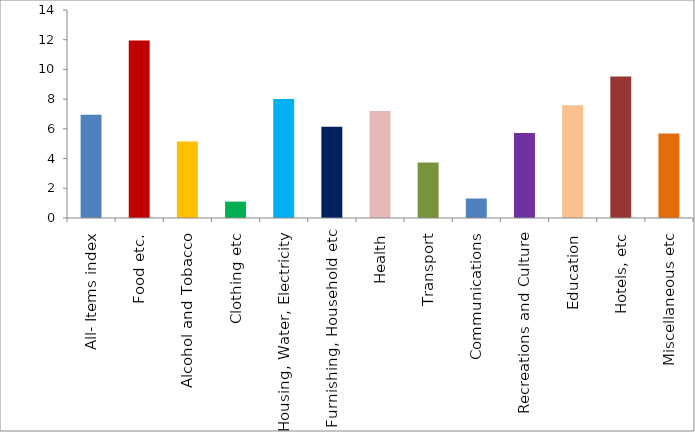
| Category | Series 0 |
|---|---|
| All- Items index | 6.955 |
| Food etc. | 11.95 |
| Alcohol and Tobacco | 5.155 |
| Clothing etc | 1.104 |
| Housing, Water, Electricity | 8.004 |
| Furnishing, Household etc | 6.138 |
| Health | 7.197 |
| Transport | 3.738 |
| Communications | 1.312 |
| Recreations and Culture | 5.718 |
| Education | 7.59 |
| Hotels, etc | 9.522 |
| Miscellaneous etc | 5.692 |